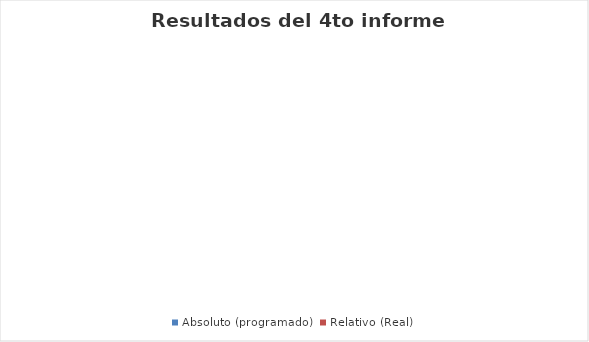
| Category |  Absoluto (programado) | Relativo (Real) |
|---|---|---|
| Diseño y actualización de los Manuales de procesos y procedimientos con motivo de la implementación del Sistema Municipal  de control interno y  Anticorrupción | 1 | 0.5 |
| Conformación del Oranismo Público Descentralizado denominado "Seccretaria Ejecutiva" del Sistema Municipal Anticorrupción | 1 | 0.7 |
| Implementación del Sistema Municipal Anticorrupción | 1 | 0.3 |
| Implementación del Sistema de Control Interno de la Administración Pública Municipal | 1 | 0 |
| Desconcentración Administrativa Municipal | 1 | 0 |